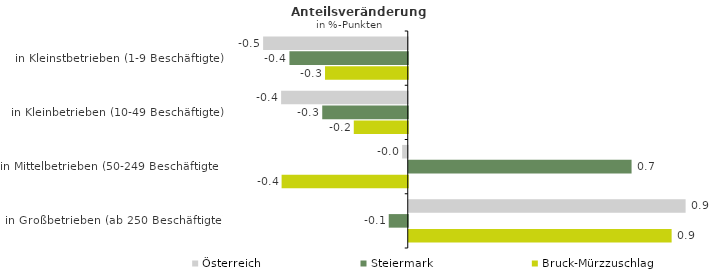
| Category | Österreich | Steiermark | Bruck-Mürzzuschlag |
|---|---|---|---|
| in Kleinstbetrieben (1-9 Beschäftigte) | -0.48 | -0.393 | -0.275 |
| in Kleinbetrieben (10-49 Beschäftigte) | -0.42 | -0.284 | -0.179 |
| in Mittelbetrieben (50-249 Beschäftigte) | -0.019 | 0.74 | -0.419 |
| in Großbetrieben (ab 250 Beschäftigte) | 0.919 | -0.063 | 0.873 |